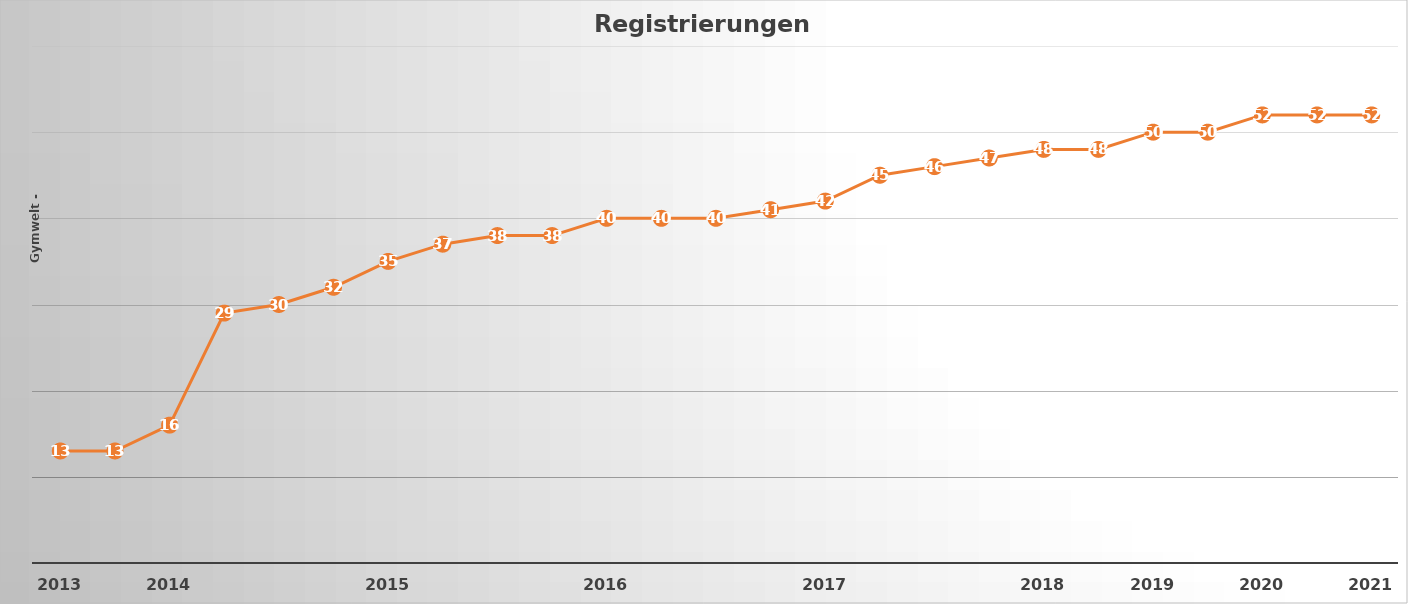
| Category | Series 1 |
|---|---|
| 2013.0 | 13 |
| nan | 13 |
| 2014.0 | 16 |
| nan | 29 |
| nan | 30 |
| nan | 32 |
| 2015.0 | 35 |
| nan | 37 |
| nan | 38 |
| nan | 38 |
| 2016.0 | 40 |
| nan | 40 |
| nan | 40 |
| nan | 41 |
| 2017.0 | 42 |
| nan | 45 |
| nan | 46 |
| nan | 47 |
| 2018.0 | 48 |
| nan | 48 |
| 2019.0 | 50 |
| nan | 50 |
| 2020.0 | 52 |
| nan | 52 |
| 2021.0 | 52 |